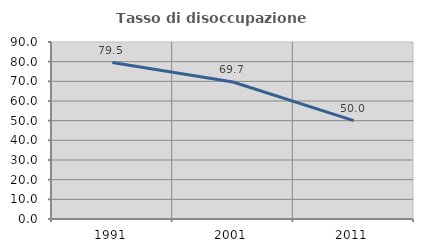
| Category | Tasso di disoccupazione giovanile  |
|---|---|
| 1991.0 | 79.528 |
| 2001.0 | 69.663 |
| 2011.0 | 50 |